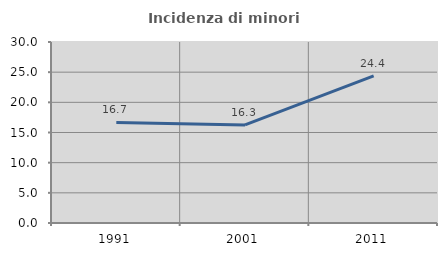
| Category | Incidenza di minori stranieri |
|---|---|
| 1991.0 | 16.667 |
| 2001.0 | 16.26 |
| 2011.0 | 24.375 |